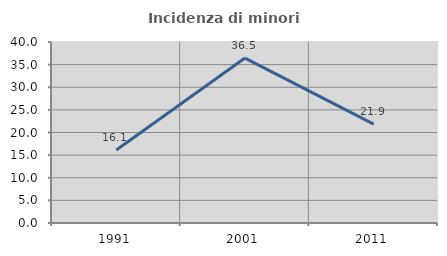
| Category | Incidenza di minori stranieri |
|---|---|
| 1991.0 | 16.129 |
| 2001.0 | 36.452 |
| 2011.0 | 21.869 |